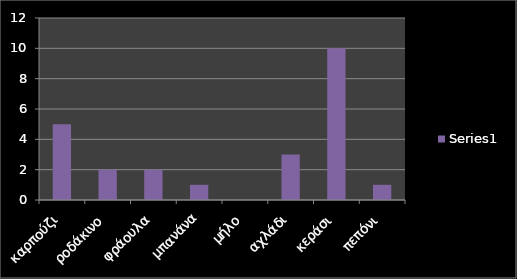
| Category | Series 0 |
|---|---|
| καρπούζι | 5 |
| ροδάκινο | 2 |
| φράουλα | 2 |
| μπανάνα | 1 |
| μήλο | 0 |
| αχλάδι | 3 |
| κεράσι | 10 |
| πεπόνι | 1 |